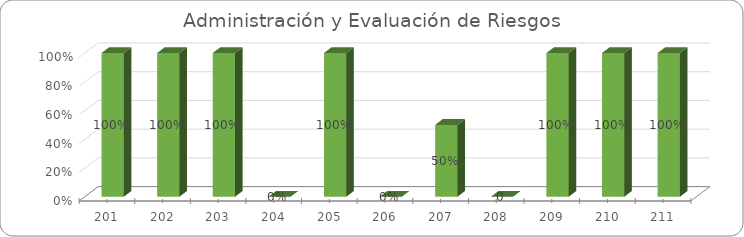
| Category | % Avance |
|---|---|
| 201.0 | 1 |
| 202.0 | 1 |
| 203.0 | 1 |
| 204.0 | 0 |
| 205.0 | 1 |
| 206.0 | 0 |
| 207.0 | 0.5 |
| 208.0 | 0 |
| 209.0 | 1 |
| 210.0 | 1 |
| 211.0 | 1 |